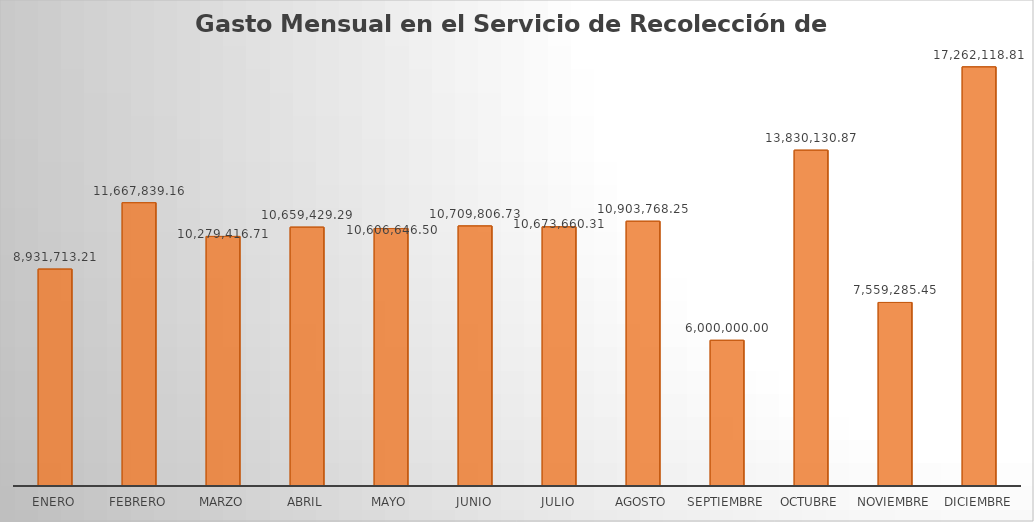
| Category | Monto |
|---|---|
| ENERO | 8931713.21 |
| FEBRERO | 11667839.16 |
| MARZO | 10279416.71 |
| ABRIL | 10659429.29 |
| MAYO | 10606646.5 |
| JUNIO | 10709806.73 |
| JULIO | 10673660.31 |
| AGOSTO | 10903768.25 |
| SEPTIEMBRE | 6000000 |
| OCTUBRE | 13830130.87 |
| NOVIEMBRE | 7559285.45 |
| DICIEMBRE | 17262118.81 |